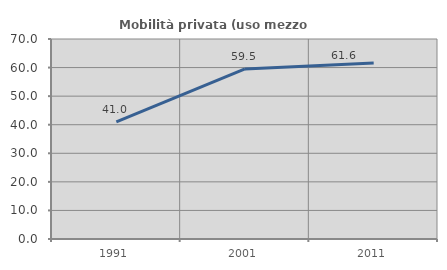
| Category | Mobilità privata (uso mezzo privato) |
|---|---|
| 1991.0 | 40.969 |
| 2001.0 | 59.527 |
| 2011.0 | 61.606 |